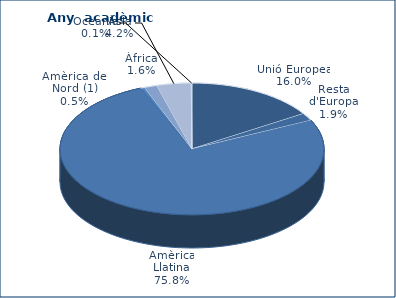
| Category | 2010-2011 |
|---|---|
| Unió Europea | 164 |
| Resta d'Europa | 19 |
| Amèrica Llatina | 776 |
| Amèrica del Nord (1) | 5 |
| Àfrica | 16 |
| Àsia | 43 |
| Oceania | 1 |